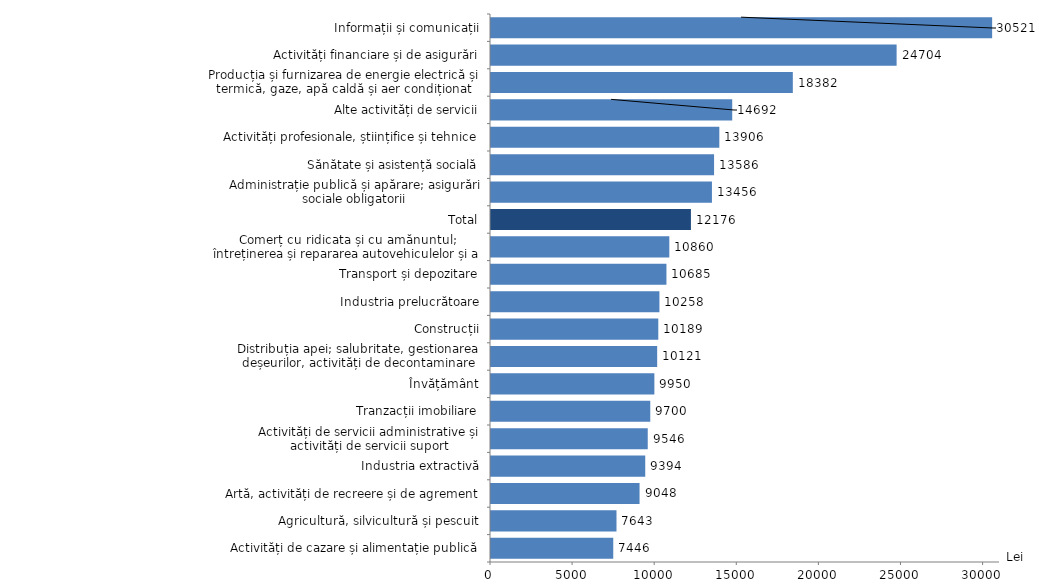
| Category | Lei |
|---|---|
| Activități de cazare și alimentație publică | 7445.8 |
| Agricultură, silvicultură și pescuit | 7643 |
| Artă, activități de recreere și de agrement | 9047.8 |
| Industria extractivă | 9393.9 |
| Activități de servicii administrative și activități de servicii suport | 9546.3 |
| Tranzacții imobiliare | 9699.9 |
| Învățământ | 9950.1 |
| Distribuția apei; salubritate, gestionarea deșeurilor, activități de decontaminare | 10120.6 |
| Construcții | 10188.5 |
| Industria prelucrătoare | 10257.7 |
| Transport și depozitare | 10684.6 |
| Comerț cu ridicata și cu amănuntul; întreținerea și repararea autovehiculelor și a motocicletelor | 10860.4 |
| Total | 12175.9 |
| Administrație publică și apărare; asigurări sociale obligatorii | 13455.9 |
| Sănătate și asistență socială | 13585.9 |
| Activități profesionale, științifice și tehnice | 13905.8 |
| Alte activități de servicii | 14691.7 |
| Producția și furnizarea de energie electrică și termică, gaze, apă caldă și aer condiționat | 18382.2 |
| Activități financiare și de asigurări | 24704 |
| Informații și comunicații | 30521.3 |